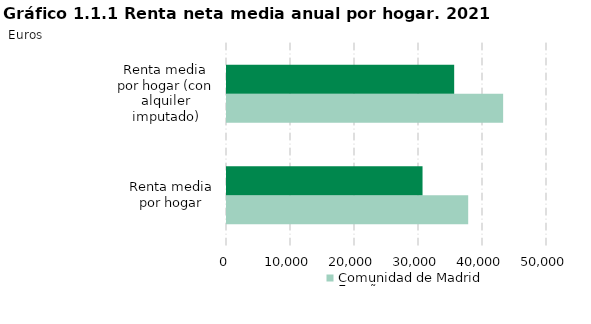
| Category | Comunidad de Madrid | España |
|---|---|---|
| Renta media por hogar | 37687 | 30552 |
| Renta media por hogar (con alquiler imputado) | 43146 | 35497 |